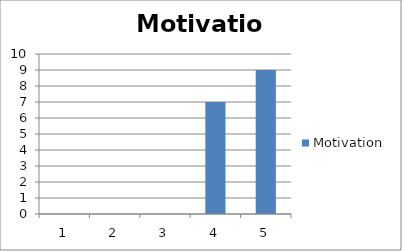
| Category | Motivation |
|---|---|
| 0 | 0 |
| 1 | 0 |
| 2 | 0 |
| 3 | 7 |
| 4 | 9 |